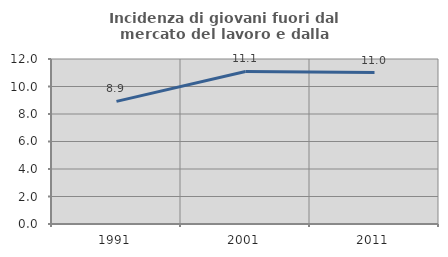
| Category | Incidenza di giovani fuori dal mercato del lavoro e dalla formazione  |
|---|---|
| 1991.0 | 8.921 |
| 2001.0 | 11.093 |
| 2011.0 | 11.011 |